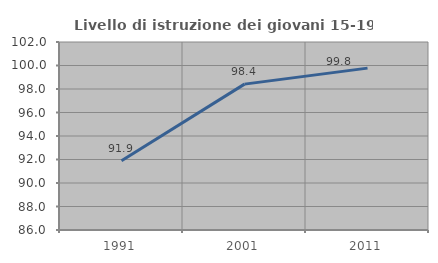
| Category | Livello di istruzione dei giovani 15-19 anni |
|---|---|
| 1991.0 | 91.901 |
| 2001.0 | 98.416 |
| 2011.0 | 99.776 |